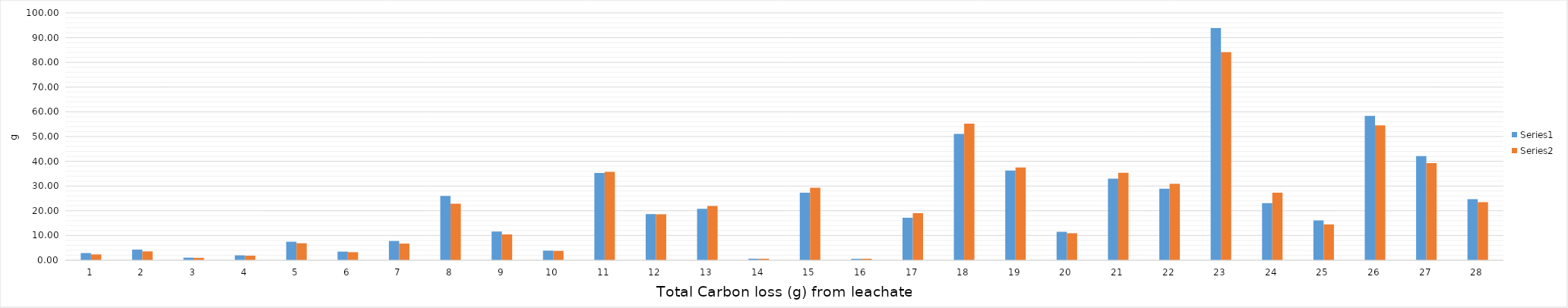
| Category | Series 0 | Series 1 |
|---|---|---|
| 0 | 2.901 | 2.342 |
| 1 | 4.297 | 3.577 |
| 2 | 1.038 | 0.966 |
| 3 | 1.96 | 1.821 |
| 4 | 7.472 | 6.86 |
| 5 | 3.484 | 3.254 |
| 6 | 7.774 | 6.725 |
| 7 | 25.981 | 22.865 |
| 8 | 11.602 | 10.425 |
| 9 | 3.873 | 3.762 |
| 10 | 35.279 | 35.719 |
| 11 | 18.649 | 18.571 |
| 12 | 20.807 | 21.952 |
| 13 | 0.618 | 0.604 |
| 14 | 27.273 | 29.265 |
| 15 | 0.562 | 0.603 |
| 16 | 17.183 | 19.021 |
| 17 | 51.095 | 55.2 |
| 18 | 36.26 | 37.537 |
| 19 | 11.492 | 10.915 |
| 20 | 32.947 | 35.386 |
| 21 | 28.878 | 30.896 |
| 22 | 93.872 | 84.098 |
| 23 | 23.059 | 27.294 |
| 24 | 16.092 | 14.476 |
| 25 | 58.347 | 54.563 |
| 26 | 42.103 | 39.239 |
| 27 | 24.68 | 23.445 |